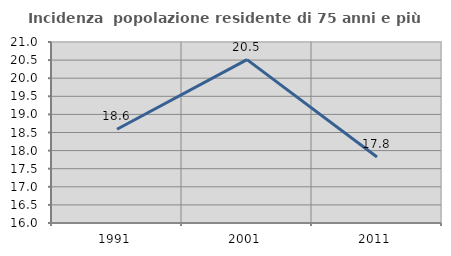
| Category | Incidenza  popolazione residente di 75 anni e più |
|---|---|
| 1991.0 | 18.59 |
| 2001.0 | 20.513 |
| 2011.0 | 17.822 |